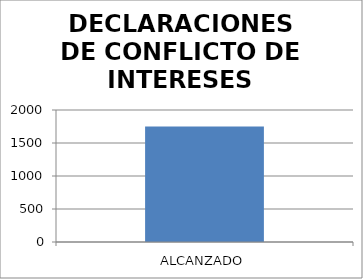
| Category | DECLARACIONES DE CONFLICTO DE INTERESES |
|---|---|
| ALCANZADO | 1750 |